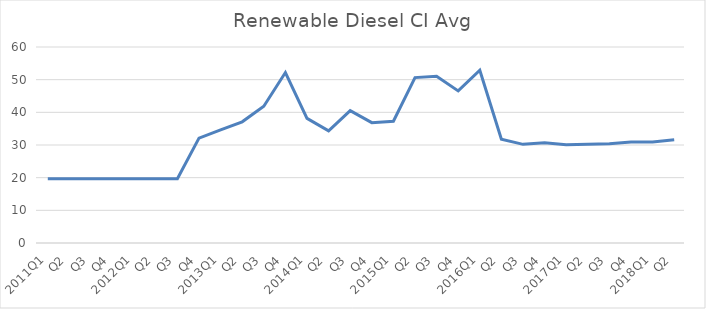
| Category | Series 0 |
|---|---|
| 2011Q1 | 19.65 |
| Q2 | 19.65 |
| Q3 | 19.65 |
| Q4 | 19.65 |
| 2012Q1 | 19.65 |
| Q2 | 19.65 |
| Q3 | 19.65 |
| Q4 | 32.11 |
| 2013Q1 | 34.65 |
| Q2 | 37.1 |
| Q3 | 41.86 |
| Q4 | 52.18 |
| 2014Q1 | 38.16 |
| Q2 | 34.32 |
| Q3 | 40.53 |
| Q4 | 36.84 |
| 2015Q1 | 37.26 |
| Q2 | 50.63 |
| Q3 | 51.06 |
| Q4 | 46.56 |
| 2016Q1 | 52.89 |
| Q2 | 31.78 |
| Q3 | 30.2 |
| Q4 | 30.71 |
| 2017Q1 | 30.11 |
| Q2 | 30.23 |
| Q3 | 30.39 |
| Q4 | 30.9 |
| 2018Q1 | 30.9 |
| Q2 | 31.58 |